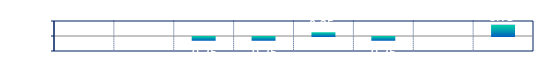
| Category | Series 0 |
|---|---|
| 0 | 0 |
| 1 | 0 |
| 2 | -0.25 |
| 3 | -0.25 |
| 4 | 0.25 |
| 5 | -0.25 |
| 6 | 0 |
| 7 | 0.75 |